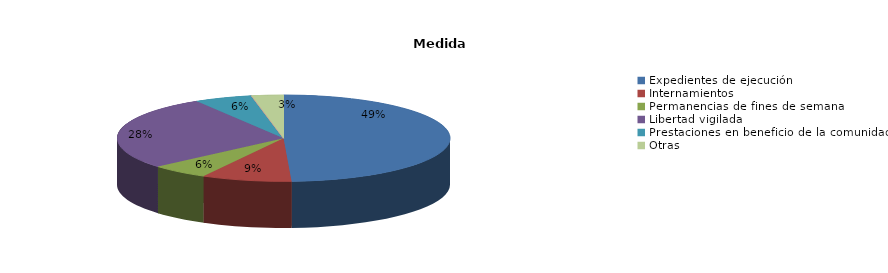
| Category | Series 0 |
|---|---|
| Expedientes de ejecución | 96 |
| Internamientos | 17 |
| Permanencias de fines de semana | 11 |
| Libertad vigilada | 54 |
| Prestaciones en beneficio de la comunidad | 11 |
| Privación de permisos y licencias | 0 |
| Convivencia Familiar Educativa | 0 |
| Amonestaciones | 0 |
| Otras | 6 |